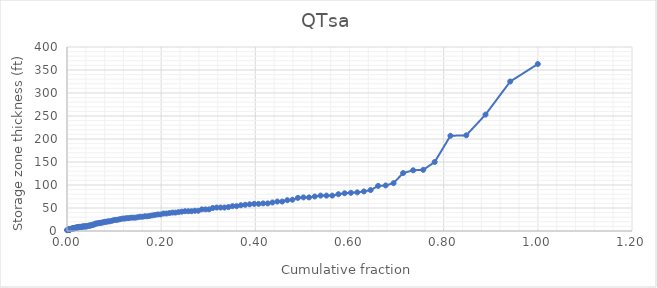
| Category | Series 0 |
|---|---|
| 0.00032310177705977385 | 2 |
| 0.0006462035541195477 | 2 |
| 0.0009693053311793215 | 2 |
| 0.0014539579967689823 | 3 |
| 0.001938610662358643 | 3 |
| 0.0024232633279483036 | 3 |
| 0.002907915993537964 | 3 |
| 0.0033925686591276248 | 3 |
| 0.0038772213247172853 | 3 |
| 0.004361873990306946 | 3 |
| 0.004846526655896607 | 3 |
| 0.005331179321486268 | 3 |
| 0.005815831987075929 | 3 |
| 0.00630048465266559 | 3 |
| 0.006946688206785138 | 4 |
| 0.007592891760904686 | 4 |
| 0.008239095315024234 | 4 |
| 0.00904684975767367 | 5 |
| 0.009854604200323105 | 5 |
| 0.01066235864297254 | 5 |
| 0.011470113085621975 | 5 |
| 0.01227786752827141 | 5 |
| 0.013247172859450733 | 6 |
| 0.014216478190630055 | 6 |
| 0.015185783521809377 | 6 |
| 0.0161550888529887 | 6 |
| 0.017285945072697907 | 7 |
| 0.018416801292407116 | 7 |
| 0.019547657512116325 | 7 |
| 0.020840064620355418 | 8 |
| 0.022132471728594512 | 8 |
| 0.023424878836833606 | 8 |
| 0.0247172859450727 | 8 |
| 0.02617124394184168 | 9 |
| 0.027625201938610663 | 9 |
| 0.029079159935379646 | 9 |
| 0.030533117932148628 | 9 |
| 0.03198707592891761 | 9 |
| 0.033602584814216484 | 10 |
| 0.035218093699515354 | 10 |
| 0.036833602584814225 | 10 |
| 0.038449111470113095 | 10 |
| 0.040064620355411966 | 10 |
| 0.041680129240710836 | 10 |
| 0.04345718901453959 | 11 |
| 0.04523424878836835 | 11 |
| 0.04717285945072699 | 12 |
| 0.04911147011308563 | 12 |
| 0.05105008077544427 | 12 |
| 0.0531502423263328 | 13 |
| 0.05541195476575122 | 14 |
| 0.057673667205169636 | 14 |
| 0.06025848142164783 | 16 |
| 0.06284329563812602 | 16 |
| 0.06558966074313409 | 17 |
| 0.06833602584814216 | 17 |
| 0.07124394184168013 | 18 |
| 0.0741518578352181 | 18 |
| 0.07722132471728596 | 19 |
| 0.0804523424878837 | 20 |
| 0.08368336025848144 | 20 |
| 0.08707592891760907 | 21 |
| 0.0904684975767367 | 21 |
| 0.0940226171243942 | 22 |
| 0.0977382875605816 | 23 |
| 0.10161550888529888 | 24 |
| 0.10549273021001616 | 24 |
| 0.10953150242326334 | 25 |
| 0.11373182552504041 | 26 |
| 0.11809369951534736 | 27 |
| 0.12245557350565431 | 27 |
| 0.12697899838449114 | 28 |
| 0.13150242326332798 | 28 |
| 0.1361873990306947 | 29 |
| 0.14087237479806144 | 29 |
| 0.14555735056542818 | 29 |
| 0.15040387722132478 | 30 |
| 0.1554119547657513 | 31 |
| 0.1604200323101778 | 31 |
| 0.16558966074313416 | 32 |
| 0.17075928917609054 | 32 |
| 0.1760904684975768 | 33 |
| 0.18158319870759296 | 34 |
| 0.187237479806139 | 35 |
| 0.19305331179321494 | 36 |
| 0.19886914378029089 | 36 |
| 0.2050080775444266 | 38 |
| 0.2111470113085623 | 38 |
| 0.2174474959612279 | 39 |
| 0.22390953150242338 | 40 |
| 0.23037156704361886 | 40 |
| 0.2369951534733442 | 41 |
| 0.24378029079159946 | 42 |
| 0.2507269789983846 | 43 |
| 0.2576736672051697 | 43 |
| 0.26462035541195483 | 43 |
| 0.2717285945072699 | 44 |
| 0.27883683360258493 | 44 |
| 0.2864297253634896 | 47 |
| 0.29402261712439426 | 47 |
| 0.3016155088852989 | 47 |
| 0.30969305331179325 | 50 |
| 0.3179321486268175 | 51 |
| 0.32617124394184177 | 51 |
| 0.33441033925686603 | 51 |
| 0.34281098546042016 | 52 |
| 0.35153473344103403 | 54 |
| 0.3602584814216479 | 54 |
| 0.36930533117932157 | 56 |
| 0.3785137318255251 | 57 |
| 0.3878836833602586 | 58 |
| 0.3974151857835219 | 59 |
| 0.40694668820678526 | 59 |
| 0.41663974151857847 | 60 |
| 0.4263327948303717 | 60 |
| 0.4363489499192247 | 62 |
| 0.44668820678513743 | 64 |
| 0.4570274636510502 | 64 |
| 0.4678513731825526 | 67 |
| 0.4788368336025849 | 68 |
| 0.4904684975767368 | 72 |
| 0.5022617124394185 | 73 |
| 0.5140549273021002 | 73 |
| 0.5261712439418418 | 75 |
| 0.5386106623586431 | 77 |
| 0.5510500807754444 | 77 |
| 0.5634894991922457 | 77 |
| 0.5764135702746366 | 80 |
| 0.5896607431340873 | 82 |
| 0.603069466882068 | 83 |
| 0.6166397415185785 | 84 |
| 0.6305331179321487 | 86 |
| 0.6449111470113087 | 89 |
| 0.6607431340872376 | 98 |
| 0.6767366720516964 | 99 |
| 0.6935379644588047 | 104 |
| 0.7138933764135704 | 126 |
| 0.7352180936995155 | 132 |
| 0.7567043618739905 | 133 |
| 0.7809369951534735 | 150 |
| 0.81437802907916 | 207 |
| 0.8479806138933765 | 208 |
| 0.8888529886914379 | 253 |
| 0.9413570274636511 | 325 |
| 1.0 | 363 |